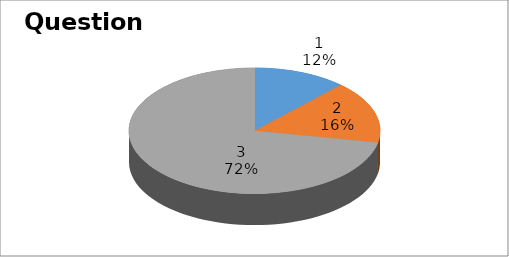
| Category | Series 0 |
|---|---|
| 0 | 3 |
| 1 | 4 |
| 2 | 18 |